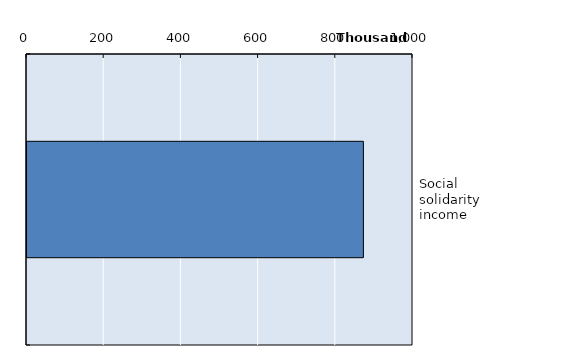
| Category | Series 0 |
|---|---|
| Social solidarity income | 871491 |